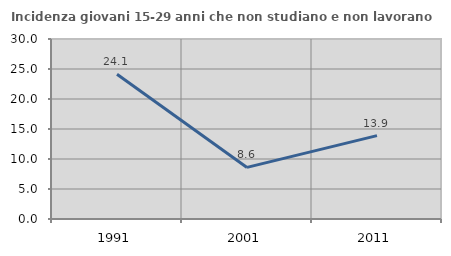
| Category | Incidenza giovani 15-29 anni che non studiano e non lavorano  |
|---|---|
| 1991.0 | 24.123 |
| 2001.0 | 8.598 |
| 2011.0 | 13.897 |